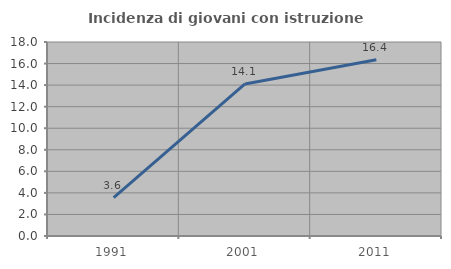
| Category | Incidenza di giovani con istruzione universitaria |
|---|---|
| 1991.0 | 3.553 |
| 2001.0 | 14.108 |
| 2011.0 | 16.355 |